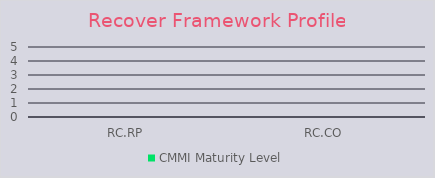
| Category | CMMI Maturity Level |
|---|---|
| RC.RP | 0 |
| RC.CO | 0 |